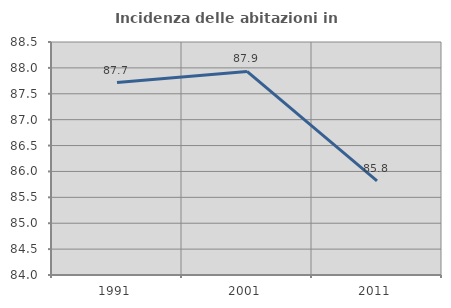
| Category | Incidenza delle abitazioni in proprietà  |
|---|---|
| 1991.0 | 87.716 |
| 2001.0 | 87.931 |
| 2011.0 | 85.817 |